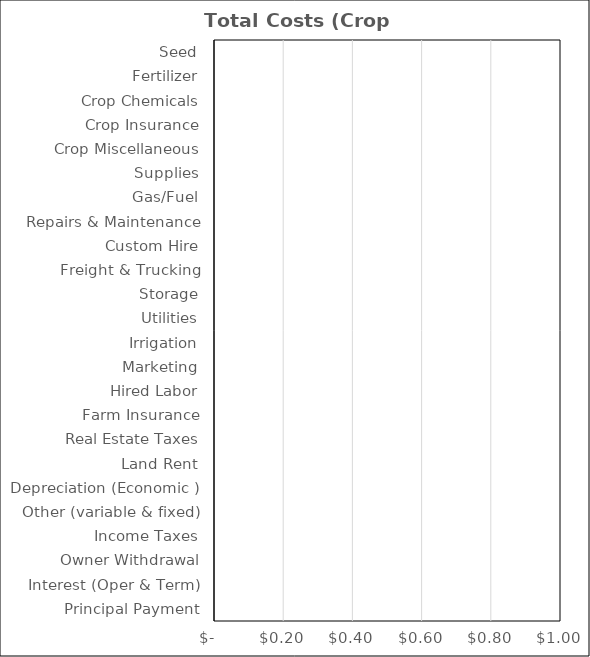
| Category | Wheat |
|---|---|
| Seed | 0 |
| Fertilizer | 0 |
| Crop Chemicals | 0 |
| Crop Insurance | 0 |
| Crop Miscellaneous | 0 |
| Supplies | 0 |
| Gas/Fuel | 0 |
| Repairs & Maintenance | 0 |
| Custom Hire | 0 |
| Freight & Trucking | 0 |
| Storage | 0 |
| Utilities | 0 |
| Irrigation | 0 |
| Marketing | 0 |
| Hired Labor | 0 |
| Farm Insurance | 0 |
| Real Estate Taxes | 0 |
| Land Rent | 0 |
| Depreciation (Economic ) | 0 |
| Other (variable & fixed) | 0 |
| Income Taxes | 0 |
| Owner Withdrawal | 0 |
| Interest (Oper & Term) | 0 |
| Principal Payment | 0 |